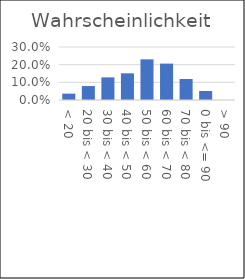
| Category | Wahrsch. |
|---|---|
| < 20 | 0.036 |
| 20 bis < 30 | 0.079 |
| 30 bis < 40 | 0.128 |
| 40 bis < 50 | 0.151 |
| 50 bis < 60 | 0.23 |
| 60 bis < 70 | 0.206 |
| 70 bis < 80 | 0.119 |
| 0 bis <= 90 | 0.051 |
| > 90 | 0 |